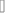
| Category | 4.65% | 4.42% | 5.29% | 6.02% |
|---|---|---|---|---|
| 0.0454 | 0.047 | 0.046 | 0.054 | 0.063 |
| 0.0473 | 0.049 | 0.047 | 0.055 | 0.064 |
| 0.0506 | 0.052 | 0.05 | 0.058 | 0.067 |
| 0.052 | 0.054 | 0.051 | 0.06 | 0.068 |
| 0.0515 | 0.053 | 0.051 | 0.059 | 0.068 |
| 0.0513 | 0.052 | 0.051 | 0.058 | 0.068 |
| 0.05 | 0.051 | 0.049 | 0.057 | 0.066 |
| 0.0485 | 0.049 | 0.047 | 0.055 | 0.064 |
| 0.0485 | 0.049 | 0.047 | 0.055 | 0.064 |
| 0.0469 | 0.048 | 0.046 | 0.053 | 0.062 |
| 0.0468 | 0.048 | 0.046 | 0.053 | 0.062 |
| 0.0485 | 0.05 | 0.048 | 0.054 | 0.063 |
| 0.0482 | 0.049 | 0.047 | 0.054 | 0.063 |
| 0.0472 | 0.048 | 0.046 | 0.053 | 0.063 |
| 0.0487 | 0.05 | 0.047 | 0.055 | 0.064 |
| 0.049 | 0.05 | 0.048 | 0.055 | 0.064 |
| 0.052 | 0.053 | 0.051 | 0.058 | 0.067 |
| 0.0511 | 0.052 | 0.05 | 0.057 | 0.066 |
| 0.0493 | 0.05 | 0.047 | 0.058 | 0.066 |
| 0.0479 | 0.048 | 0.045 | 0.057 | 0.066 |
| 0.0477 | 0.048 | 0.045 | 0.057 | 0.065 |
| 0.0452 | 0.046 | 0.042 | 0.054 | 0.064 |
| 0.0453 | 0.046 | 0.041 | 0.055 | 0.066 |
| 0.0433 | 0.044 | 0.037 | 0.053 | 0.065 |
| 0.0452 | 0.045 | 0.037 | 0.055 | 0.068 |
| 0.0439 | 0.044 | 0.035 | 0.055 | 0.069 |
| 0.0444 | 0.044 | 0.037 | 0.056 | 0.07 |
| 0.046 | 0.046 | 0.039 | 0.056 | 0.069 |
| 0.0469 | 0.047 | 0.041 | 0.057 | 0.071 |
| 0.0457 | 0.046 | 0.04 | 0.057 | 0.072 |
| 0.045 | 0.045 | 0.039 | 0.056 | 0.072 |
| 0.0427 | 0.043 | 0.037 | 0.056 | 0.073 |
| 0.0417 | 0.044 | 0.038 | 0.063 | 0.089 |
| 0.04 | 0.043 | 0.035 | 0.061 | 0.092 |
| 0.0287 | 0.032 | 0.024 | 0.05 | 0.084 |
| 0.0313 | 0.035 | 0.025 | 0.05 | 0.081 |
| 0.0359 | 0.038 | 0.029 | 0.053 | 0.081 |
| 0.0364 | 0.038 | 0.028 | 0.055 | 0.084 |
| 0.0376 | 0.038 | 0.029 | 0.054 | 0.084 |
| 0.0423 | 0.042 | 0.033 | 0.055 | 0.081 |
| 0.0452 | 0.045 | 0.037 | 0.056 | 0.075 |
| 0.0441 | 0.044 | 0.036 | 0.054 | 0.071 |
| 0.0437 | 0.043 | 0.036 | 0.053 | 0.066 |
| 0.0419 | 0.041 | 0.034 | 0.051 | 0.063 |
| 0.0419 | 0.042 | 0.034 | 0.052 | 0.063 |
| 0.0431 | 0.042 | 0.034 | 0.052 | 0.063 |
| 0.0449 | 0.044 | 0.036 | 0.053 | 0.064 |
| 0.046 | 0.045 | 0.037 | 0.053 | 0.062 |
| 0.0462 | 0.045 | 0.037 | 0.054 | 0.063 |
| 0.0464 | 0.045 | 0.037 | 0.053 | 0.063 |
| 0.0469 | 0.045 | 0.038 | 0.053 | 0.062 |
| 0.0429 | 0.041 | 0.034 | 0.05 | 0.06 |
| 0.0413 | 0.04 | 0.032 | 0.049 | 0.062 |
| 0.0399 | 0.038 | 0.03 | 0.047 | 0.06 |
| 0.038 | 0.035 | 0.027 | 0.045 | 0.057 |
| 0.0377 | 0.035 | 0.026 | 0.045 | 0.057 |
| 0.0387 | 0.035 | 0.025 | 0.047 | 0.057 |
| 0.0419 | 0.038 | 0.028 | 0.049 | 0.059 |
| 0.0442 | 0.042 | 0.033 | 0.05 | 0.061 |
| 0.0452 | 0.043 | 0.034 | 0.05 | 0.061 |
| 0.0465 | 0.044 | 0.036 | 0.052 | 0.062 |
| 0.0451 | 0.043 | 0.034 | 0.051 | 0.06 |